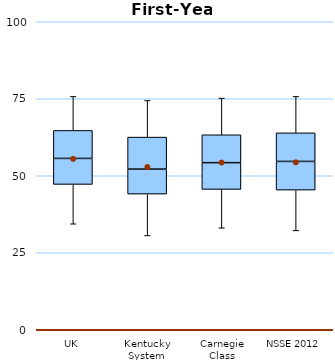
| Category | 25th | 50th | 75th |
|---|---|---|---|
| UK | 47.186 | 8.442 | 9.091 |
| Kentucky System | 44.048 | 8.117 | 10.39 |
| Carnegie Class | 45.563 | 8.689 | 9.06 |
| NSSE 2012 | 45.346 | 9.307 | 9.275 |